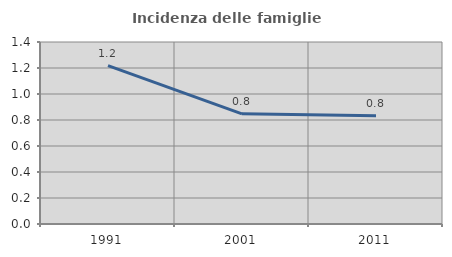
| Category | Incidenza delle famiglie numerose |
|---|---|
| 1991.0 | 1.219 |
| 2001.0 | 0.847 |
| 2011.0 | 0.834 |